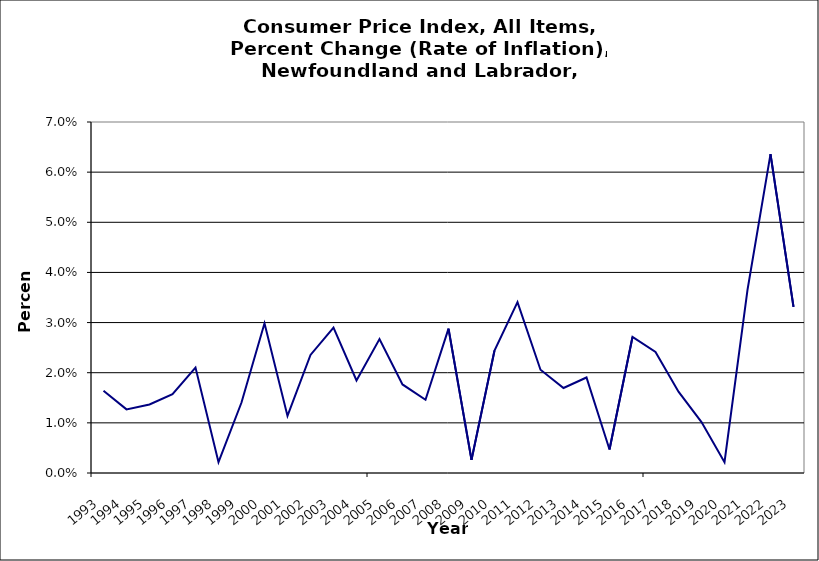
| Category | Series 0 |
|---|---|
| 1993.0 | 0.016 |
| 1994.0 | 0.013 |
| 1995.0 | 0.014 |
| 1996.0 | 0.016 |
| 1997.0 | 0.021 |
| 1998.0 | 0.002 |
| 1999.0 | 0.014 |
| 2000.0 | 0.03 |
| 2001.0 | 0.011 |
| 2002.0 | 0.024 |
| 2003.0 | 0.029 |
| 2004.0 | 0.018 |
| 2005.0 | 0.027 |
| 2006.0 | 0.018 |
| 2007.0 | 0.015 |
| 2008.0 | 0.029 |
| 2009.0 | 0.003 |
| 2010.0 | 0.024 |
| 2011.0 | 0.034 |
| 2012.0 | 0.021 |
| 2013.0 | 0.017 |
| 2014.0 | 0.019 |
| 2015.0 | 0.005 |
| 2016.0 | 0.027 |
| 2017.0 | 0.024 |
| 2018.0 | 0.016 |
| 2019.0 | 0.01 |
| 2020.0 | 0.002 |
| 2021.0 | 0.037 |
| 2022.0 | 0.064 |
| 2023.0 | 0.033 |